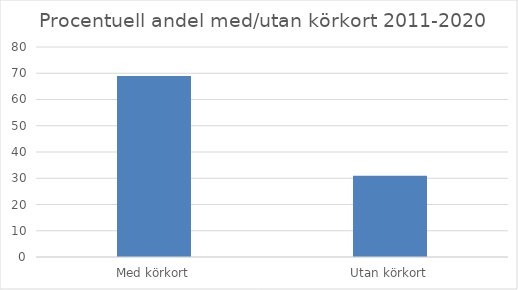
| Category | Andel % |
|---|---|
| Med körkort | 69 |
| Utan körkort | 31 |